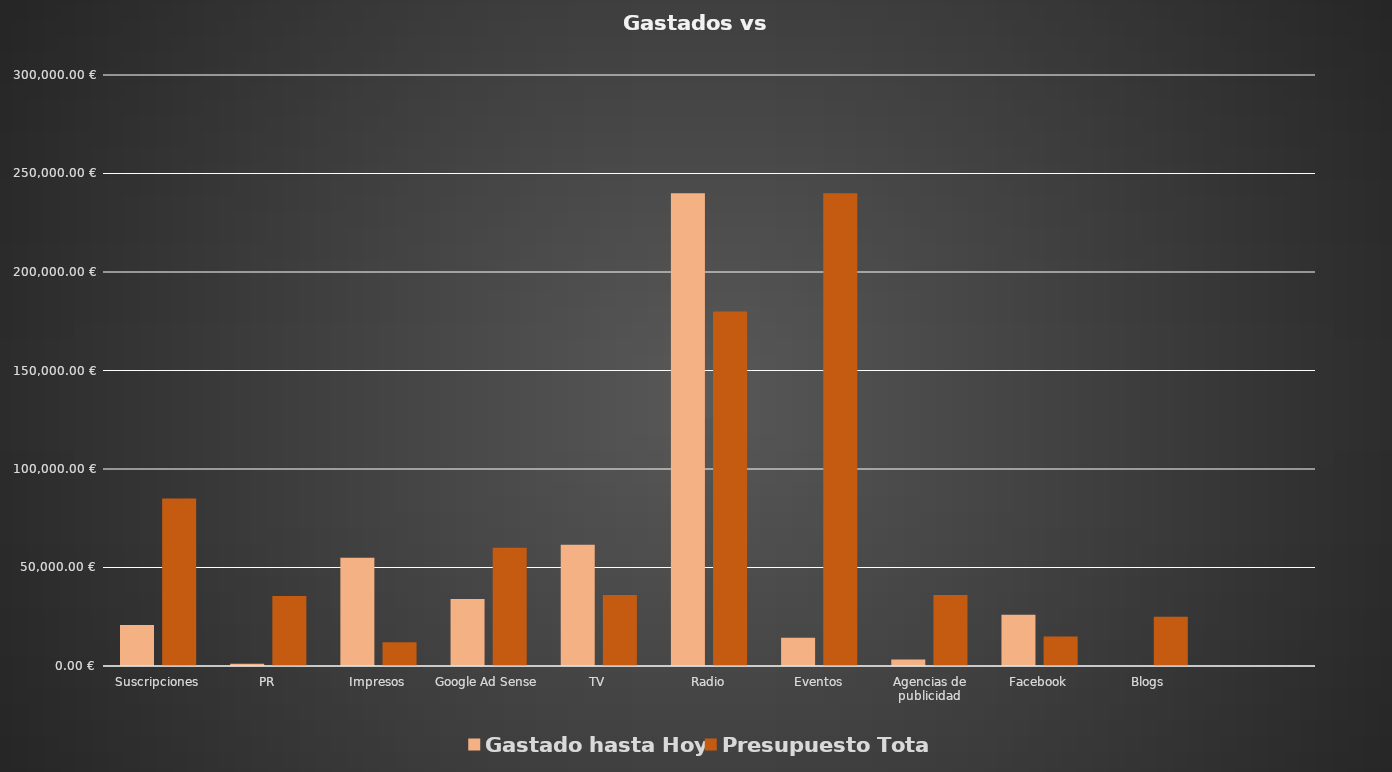
| Category | Gastado hasta Hoy | Presupuesto Total |
|---|---|---|
| Suscripciones | 20820 | 85000 |
| PR | 1140 | 35500 |
| Impresos | 55000 | 12000 |
| Google Ad Sense | 34000 | 60000 |
| TV | 61500 | 36000 |
| Radio | 240000 | 180000 |
| Eventos | 14300 | 240000 |
| Agencias de publicidad | 3260 | 36000 |
| Facebook | 26000 | 15000 |
| Blogs | 0 | 25000 |